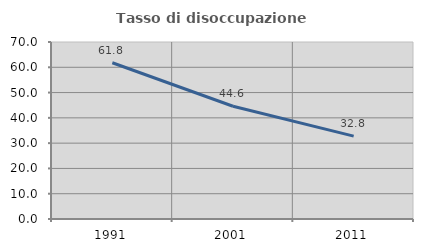
| Category | Tasso di disoccupazione giovanile  |
|---|---|
| 1991.0 | 61.791 |
| 2001.0 | 44.604 |
| 2011.0 | 32.773 |